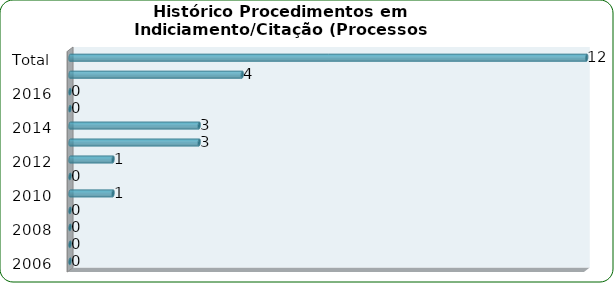
| Category | Total de Processos Administrativos Disciplinares |
|---|---|
| 2006 | 0 |
| 2007 | 0 |
| 2008 | 0 |
| 2009 | 0 |
| 2010 | 1 |
| 2011 | 0 |
| 2012 | 1 |
| 2013 | 3 |
| 2014 | 3 |
| 2015 | 0 |
| 2016 | 0 |
| 2017 | 4 |
| Total | 12 |